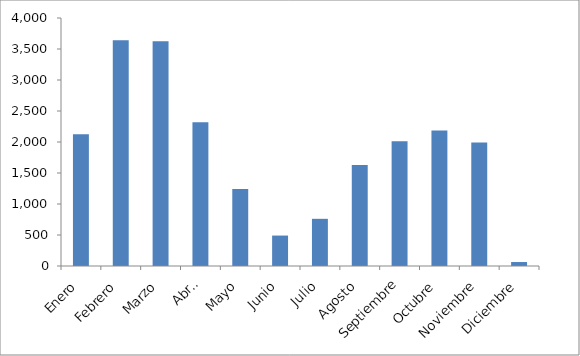
| Category | Series 0 |
|---|---|
| Enero | 2125 |
| Febrero | 3643 |
| Marzo | 3623 |
| Abril | 2319 |
| Mayo | 1240 |
| Junio | 491 |
| Julio | 761 |
| Agosto | 1629 |
| Septiembre | 2013 |
| Octubre | 2185 |
| Noviembre | 1991 |
| Diciembre | 64 |